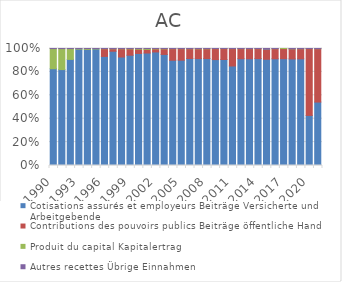
| Category | Cotisations assurés et employeurs | Contributions des pouvoirs publics | Produit du capital | Autres recettes |
|---|---|---|---|---|
| 1990.0 | 0.827 | 0 | 0.172 | 0.001 |
| 1991.0 | 0.82 | 0 | 0.179 | 0.001 |
| 1992.0 | 0.907 | 0 | 0.093 | 0.001 |
| 1993.0 | 0.994 | 0 | 0.005 | 0 |
| 1994.0 | 0.991 | 0 | 0.008 | 0.001 |
| 1995.0 | 0.996 | 0 | 0.004 | 0.001 |
| 1996.0 | 0.932 | 0.066 | 0.002 | 0 |
| 1997.0 | 0.977 | 0.021 | 0.001 | 0.001 |
| 1998.0 | 0.927 | 0.07 | 0.002 | 0 |
| 1999.0 | 0.943 | 0.054 | 0.003 | 0 |
| 2000.0 | 0.958 | 0.036 | 0.006 | 0 |
| 2001.0 | 0.961 | 0.031 | 0.008 | 0 |
| 2002.0 | 0.97 | 0.026 | 0.004 | 0 |
| 2003.0 | 0.949 | 0.047 | 0.003 | 0 |
| 2004.0 | 0.9 | 0.099 | 0.001 | 0 |
| 2005.0 | 0.9 | 0.098 | 0.001 | 0.001 |
| 2006.0 | 0.914 | 0.084 | 0.001 | 0.001 |
| 2007.0 | 0.914 | 0.083 | 0.002 | 0.001 |
| 2008.0 | 0.914 | 0.083 | 0.002 | 0.001 |
| 2009.0 | 0.905 | 0.094 | 0.001 | 0 |
| 2010.0 | 0.906 | 0.093 | 0.001 | 0 |
| 2011.0 | 0.85 | 0.149 | 0.001 | 0 |
| 2012.0 | 0.913 | 0.086 | 0.001 | 0.001 |
| 2013.0 | 0.912 | 0.086 | 0.001 | 0.001 |
| 2014.0 | 0.914 | 0.085 | 0.001 | 0 |
| 2015.0 | 0.908 | 0.085 | 0.001 | 0.006 |
| 2016.0 | 0.912 | 0.086 | 0.001 | 0.001 |
| 2017.0 | 0.913 | 0.086 | 0.001 | 0 |
| 2018.0 | 0.911 | 0.086 | 0.001 | 0.002 |
| 2019.0 | 0.912 | 0.086 | 0.001 | 0.001 |
| 2020.0 | 0.428 | 0.571 | 0 | 0 |
| 2021.0 | 0.542 | 0.456 | 0 | 0.001 |